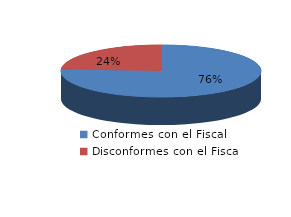
| Category | Series 0 |
|---|---|
| 0 | 271 |
| 1 | 85 |